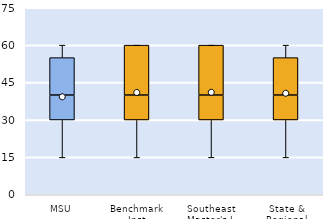
| Category | 25th | 50th | 75th |
|---|---|---|---|
| MSU | 30 | 10 | 15 |
| Benchmark Inst | 30 | 10 | 20 |
| Southeast Master's-L | 30 | 10 | 20 |
| State & Regional | 30 | 10 | 15 |